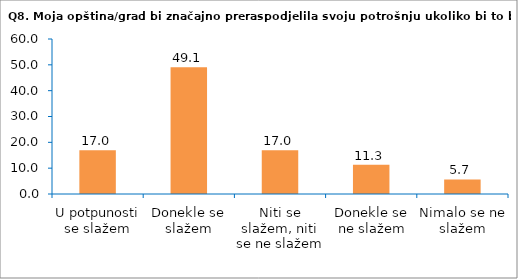
| Category | Series 0 |
|---|---|
| U potpunosti se slažem | 16.981 |
| Donekle se slažem | 49.057 |
| Niti se slažem, niti se ne slažem | 16.981 |
| Donekle se ne slažem | 11.321 |
| Nimalo se ne slažem | 5.66 |